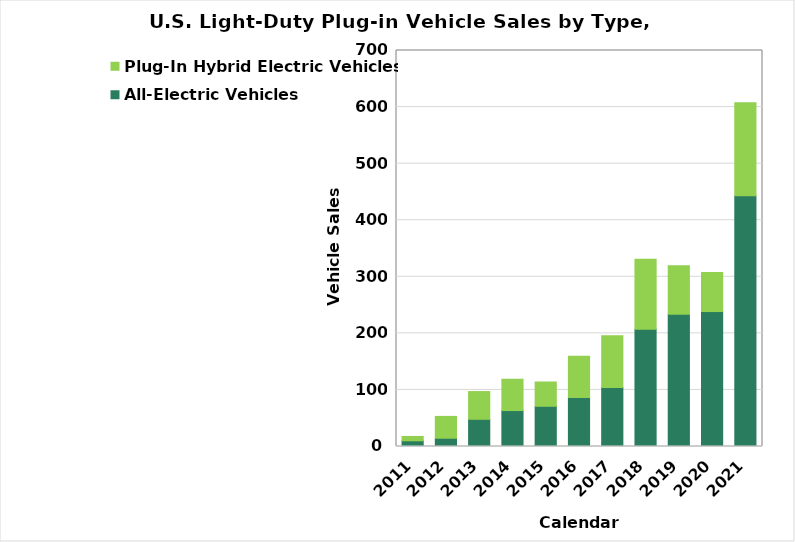
| Category | All-Electric Vehicles | Plug-In Hybrid Electric Vehicles |
|---|---|---|
| 2011.0 | 10.092 | 7.671 |
| 2012.0 | 14.587 | 38.584 |
| 2013.0 | 48.094 | 49.008 |
| 2014.0 | 63.525 | 55.357 |
| 2015.0 | 71.064 | 42.959 |
| 2016.0 | 86.731 | 72.885 |
| 2017.0 | 104.487 | 91.188 |
| 2018.0 | 207.062 | 123.883 |
| 2019.0 | 233.822 | 85.791 |
| 2020.0 | 238.54 | 69.049 |
| 2021.0 | 443.386 | 164.181 |